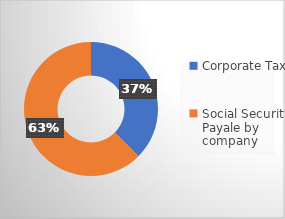
| Category | Total tax paid |
|---|---|
| Corporate Tax | 32586 |
| Social Security Payale by company | 54410 |